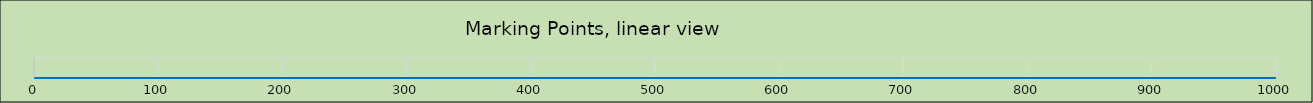
| Category | Point |
|---|---|
| 0.0 | 0 |
| 17.5 | 0 |
| 121.25 | 0 |
| 130.0 | 0 |
| 260.0 | 0 |
| 267.5 | 0 |
| 381.5 | 0 |
| 389.0 | 0 |
| 641.5 | 0 |
| 649.0 | 0 |
| 763.0 | 0 |
| 773.0 | 0 |
| 780.5 | 0 |
| 937.0 | 0 |